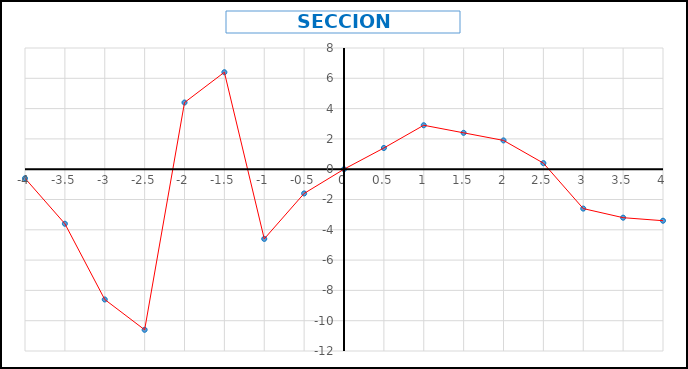
| Category | Series 0 |
|---|---|
| -4.0 | -0.6 |
| -3.5 | -3.6 |
| -3.0 | -8.6 |
| -2.5 | -10.6 |
| -2.0 | 4.4 |
| -1.5 | 6.4 |
| -1.0 | -4.6 |
| -0.5 | -1.6 |
| 0.0 | 0 |
| 0.5 | 1.4 |
| 1.0 | 2.9 |
| 1.5 | 2.4 |
| 2.0 | 1.9 |
| 2.5 | 0.4 |
| 3.0 | -2.6 |
| 3.5 | -3.2 |
| 4.0 | -3.4 |